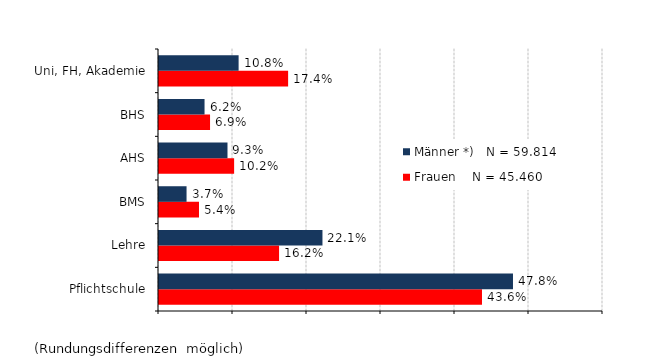
| Category | Frauen    N = 45.460 | Männer *)   N = 59.814 |
|---|---|---|
| Pflichtschule | 0.436 | 0.478 |
| Lehre | 0.162 | 0.221 |
| BMS | 0.054 | 0.037 |
| AHS | 0.102 | 0.093 |
| BHS | 0.069 | 0.062 |
| Uni, FH, Akademie | 0.174 | 0.108 |